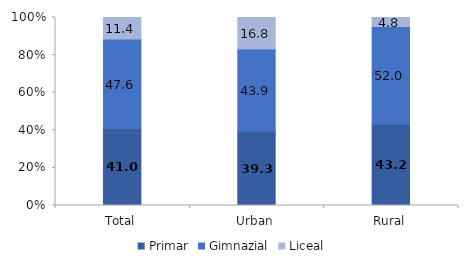
| Category | Primar | Gimnazial | Liceal |
|---|---|---|---|
| Total | 41 | 47.6 | 11.4 |
| Urban | 39.3 | 43.9 | 16.8 |
| Rural | 43.2 | 52 | 4.8 |